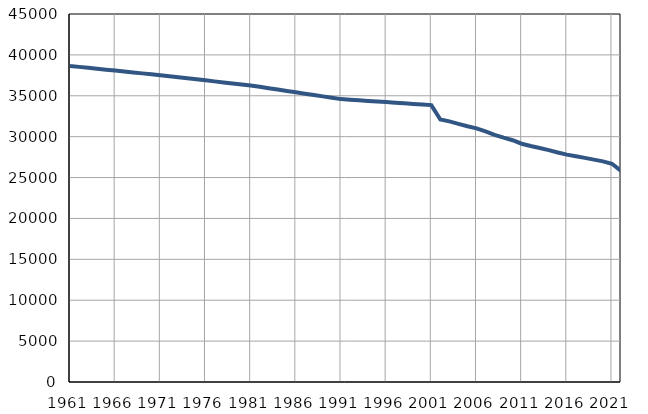
| Category | Population
size |
|---|---|
| 1961.0 | 38648 |
| 1962.0 | 38534 |
| 1963.0 | 38421 |
| 1964.0 | 38307 |
| 1965.0 | 38194 |
| 1966.0 | 38080 |
| 1967.0 | 37967 |
| 1968.0 | 37853 |
| 1969.0 | 37739 |
| 1970.0 | 37626 |
| 1971.0 | 37512 |
| 1972.0 | 37387 |
| 1973.0 | 37261 |
| 1974.0 | 37136 |
| 1975.0 | 37011 |
| 1976.0 | 36886 |
| 1977.0 | 36760 |
| 1978.0 | 36635 |
| 1979.0 | 36510 |
| 1980.0 | 36384 |
| 1981.0 | 36259 |
| 1982.0 | 36092 |
| 1983.0 | 35926 |
| 1984.0 | 35759 |
| 1985.0 | 35593 |
| 1986.0 | 35426 |
| 1987.0 | 35259 |
| 1988.0 | 35093 |
| 1989.0 | 34926 |
| 1990.0 | 34760 |
| 1991.0 | 34593 |
| 1992.0 | 34520 |
| 1993.0 | 34447 |
| 1994.0 | 34374 |
| 1995.0 | 34301 |
| 1996.0 | 34228 |
| 1997.0 | 34155 |
| 1998.0 | 34082 |
| 1999.0 | 34009 |
| 2000.0 | 33936 |
| 2001.0 | 33863 |
| 2002.0 | 32095 |
| 2003.0 | 31876 |
| 2004.0 | 31568 |
| 2005.0 | 31272 |
| 2006.0 | 31014 |
| 2007.0 | 30646 |
| 2008.0 | 30223 |
| 2009.0 | 29878 |
| 2010.0 | 29562 |
| 2011.0 | 29137 |
| 2012.0 | 28852 |
| 2013.0 | 28612 |
| 2014.0 | 28358 |
| 2015.0 | 28068 |
| 2016.0 | 27808 |
| 2017.0 | 27603 |
| 2018.0 | 27407 |
| 2019.0 | 27193 |
| 2020.0 | 26976 |
| 2021.0 | 26686 |
| 2022.0 | 25807 |